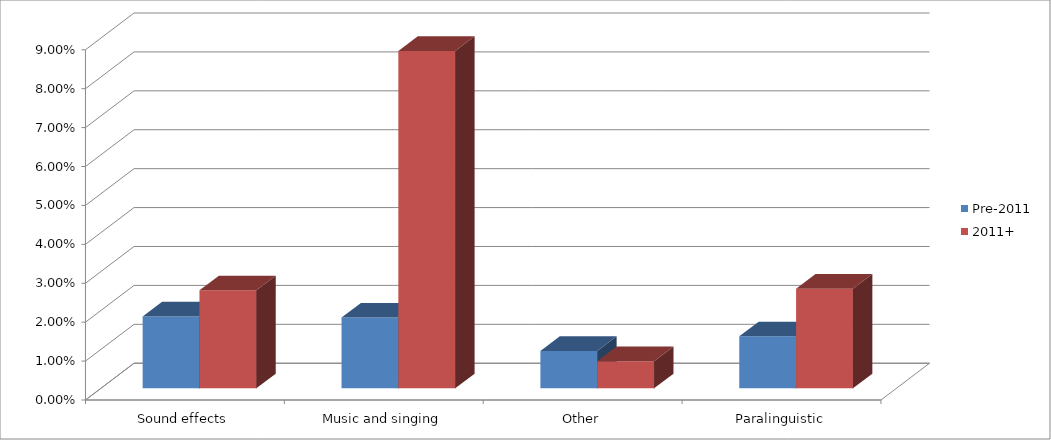
| Category | Pre-2011 | 2011+ |
|---|---|---|
| Sound effects | 0.018 | 0.025 |
| Music and singing | 0.018 | 0.087 |
| Other | 0.01 | 0.007 |
| Paralinguistic | 0.013 | 0.026 |